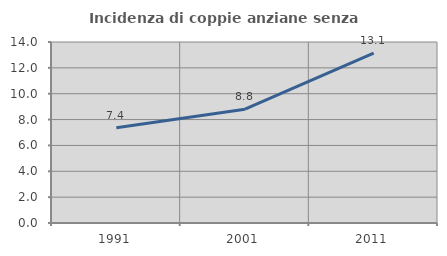
| Category | Incidenza di coppie anziane senza figli  |
|---|---|
| 1991.0 | 7.369 |
| 2001.0 | 8.801 |
| 2011.0 | 13.141 |